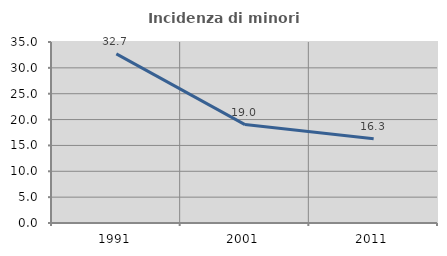
| Category | Incidenza di minori stranieri |
|---|---|
| 1991.0 | 32.692 |
| 2001.0 | 19.032 |
| 2011.0 | 16.279 |